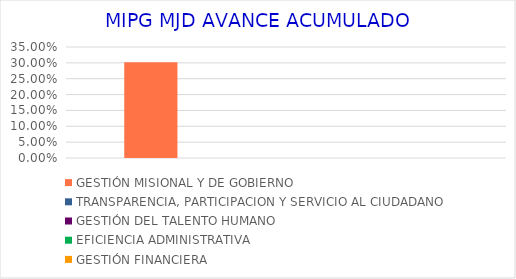
| Category | GESTIÓN MISIONAL Y DE GOBIERNO | TRANSPARENCIA, PARTICIPACION Y SERVICIO AL CIUDADANO | GESTIÓN DEL TALENTO HUMANO | EFICIENCIA ADMINISTRATIVA | GESTIÓN FINANCIERA |
|---|---|---|---|---|---|
| 0 | 0.302 | 0 | 0 | 0 | 0 |